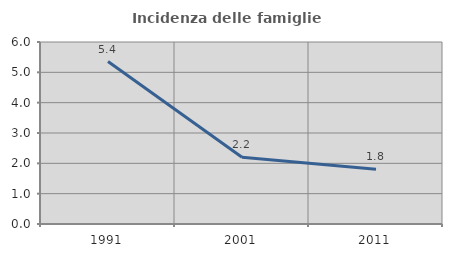
| Category | Incidenza delle famiglie numerose |
|---|---|
| 1991.0 | 5.357 |
| 2001.0 | 2.199 |
| 2011.0 | 1.802 |